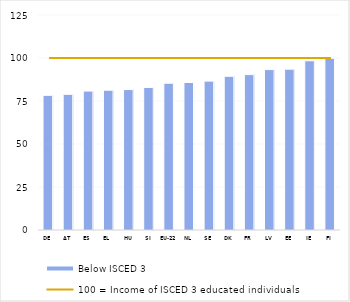
| Category | Below ISCED 3 |
|---|---|
| DE | 78.284 |
| AT | 78.882 |
| ES | 80.783 |
| EL | 81.262 |
| HU | 81.648 |
| SI | 82.878 |
| EU-22 | 85.341 |
| NL | 85.759 |
| SE | 86.562 |
| DK | 89.369 |
| FR | 90.35 |
| LV | 93.263 |
| EE | 93.521 |
| IE | 98.401 |
| FI | 99.871 |